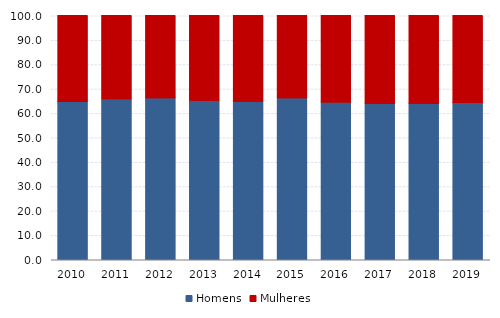
| Category | Homens | Mulheres |
|---|---|---|
| 2010.0 | 64.706 | 35.294 |
| 2011.0 | 65.909 | 34.091 |
| 2012.0 | 66.316 | 33.684 |
| 2013.0 | 65.217 | 34.783 |
| 2014.0 | 64.894 | 35.106 |
| 2015.0 | 66.327 | 33.673 |
| 2016.0 | 64.583 | 35.417 |
| 2017.0 | 64.078 | 35.922 |
| 2018.0 | 64.035 | 35.965 |
| 2019.0 | 64.344 | 35.656 |